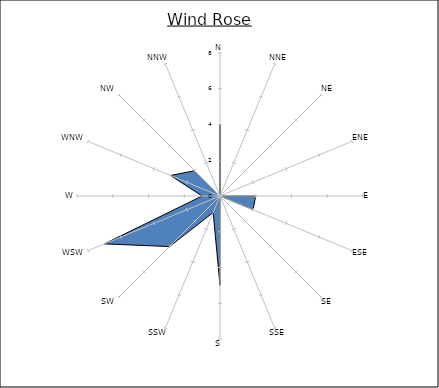
| Category | Series 0 |
|---|---|
| N | 4 |
| NNE | 0 |
| NE | 0 |
| ENE | 0 |
| E | 2 |
| ESE | 2 |
| SE | 0 |
| SSE | 0 |
| S | 5 |
| SSW | 1 |
| SW | 4 |
| WSW | 7 |
| W | 1 |
| WNW | 3 |
| NW | 2 |
| NNW | 0 |